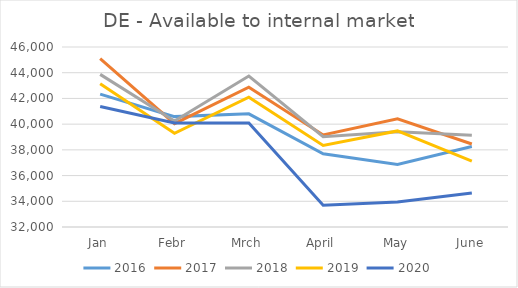
| Category | 2016 | 2017 | 2018 | 2019 | 2020 |
|---|---|---|---|---|---|
| Jan | 42339 | 45095.047 | 43871.612 | 43146.659 | 41377.86 |
| Febr | 40585 | 40037.803 | 40246.963 | 39282.431 | 40094.893 |
| Mrch | 40799 | 42869.924 | 43739.631 | 42101.521 | 40080.317 |
| April | 37701 | 39161.911 | 39023.906 | 38344.904 | 33691.742 |
| May | 36866 | 40413.549 | 39403.393 | 39473.797 | 33940.479 |
| June | 38267 | 38453.372 | 39134.121 | 37125.156 | 34648.206 |